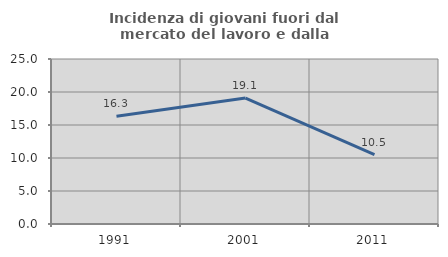
| Category | Incidenza di giovani fuori dal mercato del lavoro e dalla formazione  |
|---|---|
| 1991.0 | 16.327 |
| 2001.0 | 19.075 |
| 2011.0 | 10.526 |